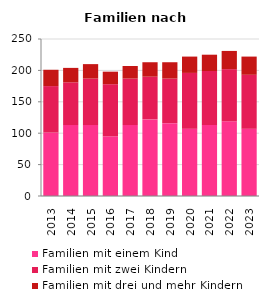
| Category | Familien mit einem Kind | Familien mit zwei Kindern | Familien mit drei und mehr Kindern |
|---|---|---|---|
| 2013.0 | 101 | 74 | 26 |
| 2014.0 | 113 | 68 | 23 |
| 2015.0 | 113 | 74 | 23 |
| 2016.0 | 95 | 83 | 20 |
| 2017.0 | 113 | 74 | 20 |
| 2018.0 | 122 | 68 | 23 |
| 2019.0 | 116 | 71 | 26 |
| 2020.0 | 107 | 89 | 26 |
| 2021.0 | 113 | 86 | 26 |
| 2022.0 | 119 | 83 | 29 |
| 2023.0 | 107 | 86 | 29 |